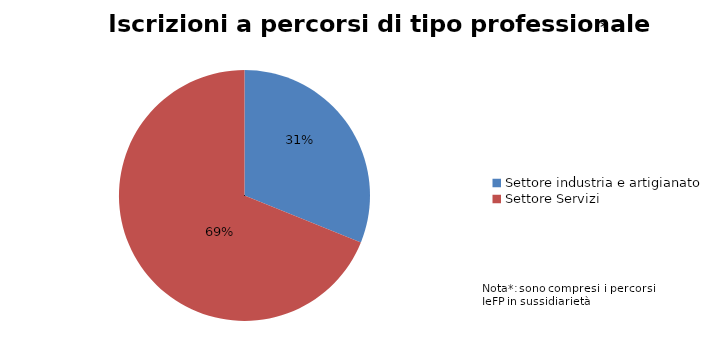
| Category | Series 0 |
|---|---|
| Settore industria e artigianato | 2211 |
| Settore Servizi | 4896 |